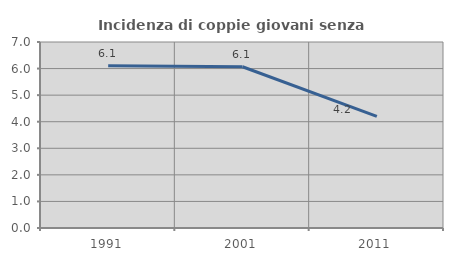
| Category | Incidenza di coppie giovani senza figli |
|---|---|
| 1991.0 | 6.105 |
| 2001.0 | 6.067 |
| 2011.0 | 4.198 |